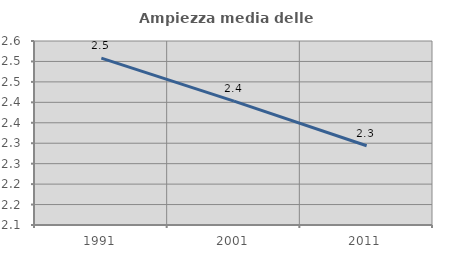
| Category | Ampiezza media delle famiglie |
|---|---|
| 1991.0 | 2.508 |
| 2001.0 | 2.403 |
| 2011.0 | 2.294 |